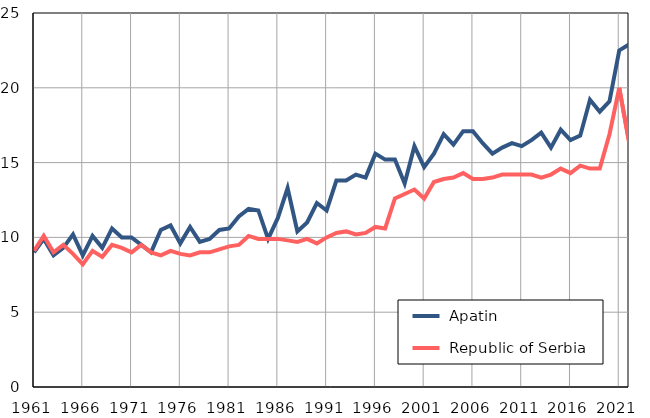
| Category |  Apatin |  Republic of Serbia |
|---|---|---|
| 1961.0 | 9 | 9.1 |
| 1962.0 | 9.9 | 10.1 |
| 1963.0 | 8.8 | 9 |
| 1964.0 | 9.3 | 9.5 |
| 1965.0 | 10.2 | 8.9 |
| 1966.0 | 8.8 | 8.2 |
| 1967.0 | 10.1 | 9.1 |
| 1968.0 | 9.3 | 8.7 |
| 1969.0 | 10.6 | 9.5 |
| 1970.0 | 10 | 9.3 |
| 1971.0 | 10 | 9 |
| 1972.0 | 9.5 | 9.5 |
| 1973.0 | 9 | 9 |
| 1974.0 | 10.5 | 8.8 |
| 1975.0 | 10.8 | 9.1 |
| 1976.0 | 9.6 | 8.9 |
| 1977.0 | 10.7 | 8.8 |
| 1978.0 | 9.7 | 9 |
| 1979.0 | 9.9 | 9 |
| 1980.0 | 10.5 | 9.2 |
| 1981.0 | 10.6 | 9.4 |
| 1982.0 | 11.4 | 9.5 |
| 1983.0 | 11.9 | 10.1 |
| 1984.0 | 11.8 | 9.9 |
| 1985.0 | 9.9 | 9.9 |
| 1986.0 | 11.3 | 9.9 |
| 1987.0 | 13.3 | 9.8 |
| 1988.0 | 10.4 | 9.7 |
| 1989.0 | 11 | 9.9 |
| 1990.0 | 12.3 | 9.6 |
| 1991.0 | 11.8 | 10 |
| 1992.0 | 13.8 | 10.3 |
| 1993.0 | 13.8 | 10.4 |
| 1994.0 | 14.2 | 10.2 |
| 1995.0 | 14 | 10.3 |
| 1996.0 | 15.6 | 10.7 |
| 1997.0 | 15.2 | 10.6 |
| 1998.0 | 15.2 | 12.6 |
| 1999.0 | 13.6 | 12.9 |
| 2000.0 | 16.1 | 13.2 |
| 2001.0 | 14.7 | 12.6 |
| 2002.0 | 15.6 | 13.7 |
| 2003.0 | 16.9 | 13.9 |
| 2004.0 | 16.2 | 14 |
| 2005.0 | 17.1 | 14.3 |
| 2006.0 | 17.1 | 13.9 |
| 2007.0 | 16.3 | 13.9 |
| 2008.0 | 15.6 | 14 |
| 2009.0 | 16 | 14.2 |
| 2010.0 | 16.3 | 14.2 |
| 2011.0 | 16.1 | 14.2 |
| 2012.0 | 16.5 | 14.2 |
| 2013.0 | 17 | 14 |
| 2014.0 | 16 | 14.2 |
| 2015.0 | 17.2 | 14.6 |
| 2016.0 | 16.5 | 14.3 |
| 2017.0 | 16.8 | 14.8 |
| 2018.0 | 19.2 | 14.6 |
| 2019.0 | 18.4 | 14.6 |
| 2020.0 | 19.1 | 16.9 |
| 2021.0 | 22.5 | 20 |
| 2022.0 | 22.9 | 16.4 |